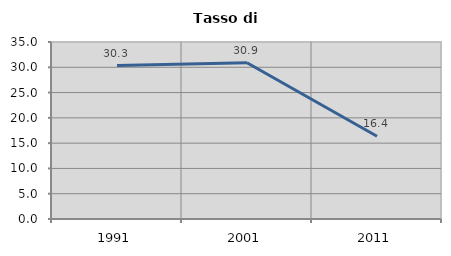
| Category | Tasso di disoccupazione   |
|---|---|
| 1991.0 | 30.342 |
| 2001.0 | 30.901 |
| 2011.0 | 16.377 |